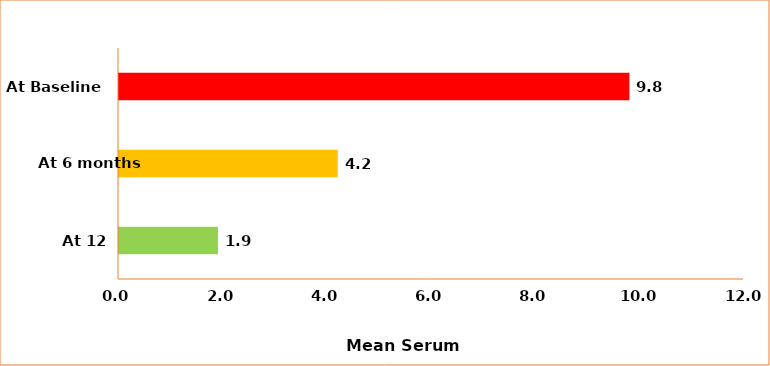
| Category | Series 0 |
|---|---|
| At 12 months | 1.9 |
| At 6 months | 4.2 |
| At Baseline | 9.8 |